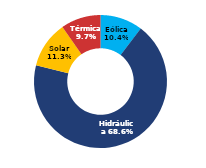
| Category | Sur |
|---|---|
| Eólica | 53.78 |
| Hidráulica | 356.396 |
| Solar | 58.921 |
| Térmica | 50.397 |